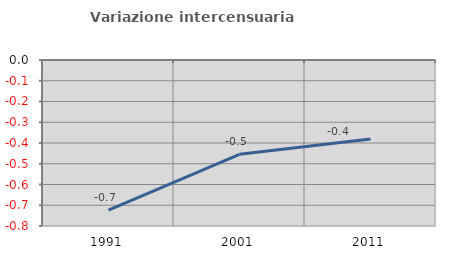
| Category | Variazione intercensuaria annua |
|---|---|
| 1991.0 | -0.723 |
| 2001.0 | -0.455 |
| 2011.0 | -0.381 |